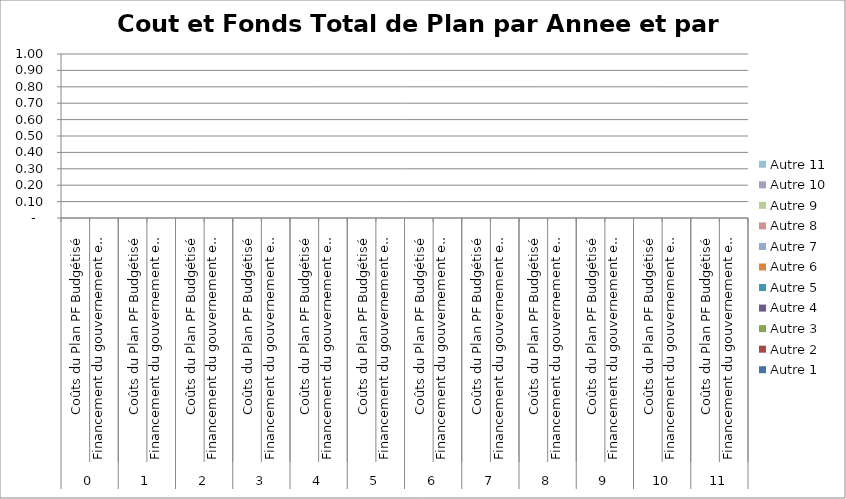
| Category | Autre 1 | Autre 2 | Autre 3 | Autre 4 | Autre 5 | Autre 6 | Autre 7 | Autre 8 | Autre 9 | Autre 10 | Autre 11 |
|---|---|---|---|---|---|---|---|---|---|---|---|
| 0 | 0 | 0 | 0 | 0 | 0 | 0 | 0 | 0 | 0 | 0 | 0 |
| 1 | 0 | 0 | 0 | 0 | 0 | 0 | 0 | 0 | 0 | 0 | 0 |
| 2 | 0 | 0 | 0 | 0 | 0 | 0 | 0 | 0 | 0 | 0 | 0 |
| 3 | 0 | 0 | 0 | 0 | 0 | 0 | 0 | 0 | 0 | 0 | 0 |
| 4 | 0 | 0 | 0 | 0 | 0 | 0 | 0 | 0 | 0 | 0 | 0 |
| 5 | 0 | 0 | 0 | 0 | 0 | 0 | 0 | 0 | 0 | 0 | 0 |
| 6 | 0 | 0 | 0 | 0 | 0 | 0 | 0 | 0 | 0 | 0 | 0 |
| 7 | 0 | 0 | 0 | 0 | 0 | 0 | 0 | 0 | 0 | 0 | 0 |
| 8 | 0 | 0 | 0 | 0 | 0 | 0 | 0 | 0 | 0 | 0 | 0 |
| 9 | 0 | 0 | 0 | 0 | 0 | 0 | 0 | 0 | 0 | 0 | 0 |
| 10 | 0 | 0 | 0 | 0 | 0 | 0 | 0 | 0 | 0 | 0 | 0 |
| 11 | 0 | 0 | 0 | 0 | 0 | 0 | 0 | 0 | 0 | 0 | 0 |
| 12 | 0 | 0 | 0 | 0 | 0 | 0 | 0 | 0 | 0 | 0 | 0 |
| 13 | 0 | 0 | 0 | 0 | 0 | 0 | 0 | 0 | 0 | 0 | 0 |
| 14 | 0 | 0 | 0 | 0 | 0 | 0 | 0 | 0 | 0 | 0 | 0 |
| 15 | 0 | 0 | 0 | 0 | 0 | 0 | 0 | 0 | 0 | 0 | 0 |
| 16 | 0 | 0 | 0 | 0 | 0 | 0 | 0 | 0 | 0 | 0 | 0 |
| 17 | 0 | 0 | 0 | 0 | 0 | 0 | 0 | 0 | 0 | 0 | 0 |
| 18 | 0 | 0 | 0 | 0 | 0 | 0 | 0 | 0 | 0 | 0 | 0 |
| 19 | 0 | 0 | 0 | 0 | 0 | 0 | 0 | 0 | 0 | 0 | 0 |
| 20 | 0 | 0 | 0 | 0 | 0 | 0 | 0 | 0 | 0 | 0 | 0 |
| 21 | 0 | 0 | 0 | 0 | 0 | 0 | 0 | 0 | 0 | 0 | 0 |
| 22 | 0 | 0 | 0 | 0 | 0 | 0 | 0 | 0 | 0 | 0 | 0 |
| 23 | 0 | 0 | 0 | 0 | 0 | 0 | 0 | 0 | 0 | 0 | 0 |